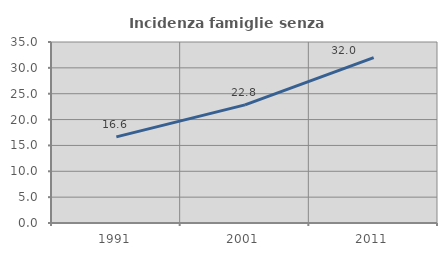
| Category | Incidenza famiglie senza nuclei |
|---|---|
| 1991.0 | 16.647 |
| 2001.0 | 22.847 |
| 2011.0 | 31.995 |